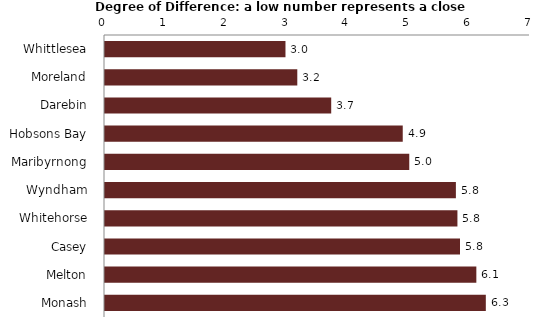
| Category | Series 0 |
|---|---|
| Whittlesea  | 2.972 |
| Moreland  | 3.167 |
| Darebin  | 3.726 |
| Hobsons Bay  | 4.904 |
| Maribyrnong  | 5.011 |
| Wyndham  | 5.779 |
| Whitehorse  | 5.805 |
| Casey  | 5.847 |
| Melton  | 6.116 |
| Monash  | 6.272 |